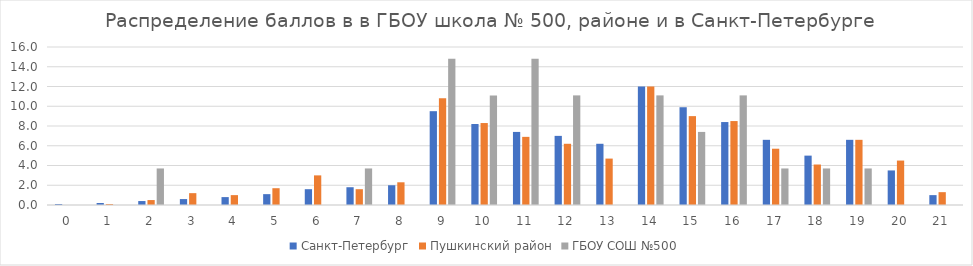
| Category | Санкт-Петербург | Пушкинский район | ГБОУ СОШ №500 |
|---|---|---|---|
| 0.0 | 0.1 | 0 | 0 |
| 1.0 | 0.2 | 0.1 | 0 |
| 2.0 | 0.4 | 0.5 | 3.7 |
| 3.0 | 0.6 | 1.2 | 0 |
| 4.0 | 0.8 | 1 | 0 |
| 5.0 | 1.1 | 1.7 | 0 |
| 6.0 | 1.6 | 3 | 0 |
| 7.0 | 1.8 | 1.6 | 3.7 |
| 8.0 | 2 | 2.3 | 0 |
| 9.0 | 9.5 | 10.8 | 14.8 |
| 10.0 | 8.2 | 8.3 | 11.1 |
| 11.0 | 7.4 | 6.9 | 14.8 |
| 12.0 | 7 | 6.2 | 11.1 |
| 13.0 | 6.2 | 4.7 | 0 |
| 14.0 | 12 | 12 | 11.1 |
| 15.0 | 9.9 | 9 | 7.4 |
| 16.0 | 8.4 | 8.5 | 11.1 |
| 17.0 | 6.6 | 5.7 | 3.7 |
| 18.0 | 5 | 4.1 | 3.7 |
| 19.0 | 6.6 | 6.6 | 3.7 |
| 20.0 | 3.5 | 4.5 | 0 |
| 21.0 | 1 | 1.3 | 0 |